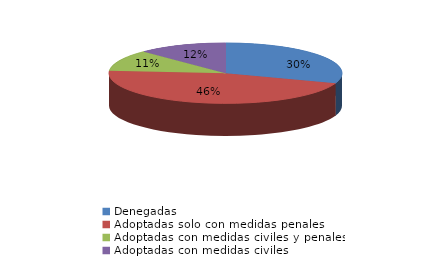
| Category | Series 0 |
|---|---|
| Denegadas | 96 |
| Adoptadas solo con medidas penales | 145 |
| Adoptadas con medidas civiles y penales | 36 |
| Adoptadas con medidas civiles | 39 |